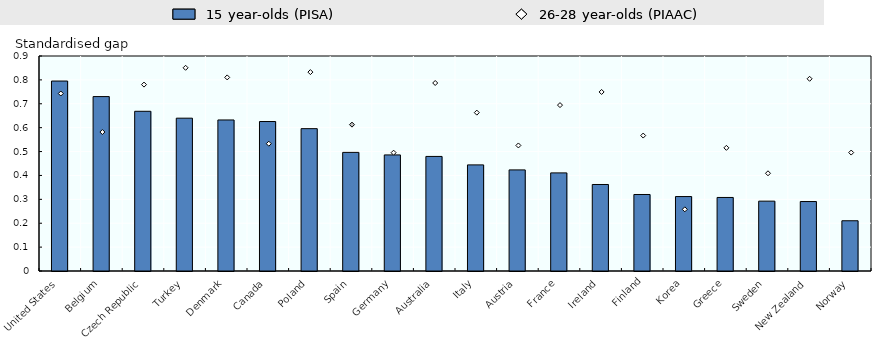
| Category | 15 year-olds (PISA)  |
|---|---|
| United States | 0.795 |
| Belgium | 0.73 |
| Czech Republic | 0.669 |
| Turkey | 0.64 |
| Denmark | 0.632 |
| Canada | 0.626 |
| Poland | 0.596 |
| Spain | 0.497 |
| Germany | 0.486 |
| Australia | 0.48 |
| Italy | 0.444 |
| Austria | 0.423 |
| France | 0.411 |
| Ireland | 0.362 |
| Finland | 0.32 |
| Korea | 0.312 |
| Greece | 0.308 |
| Sweden | 0.292 |
| New Zealand | 0.291 |
| Norway | 0.21 |